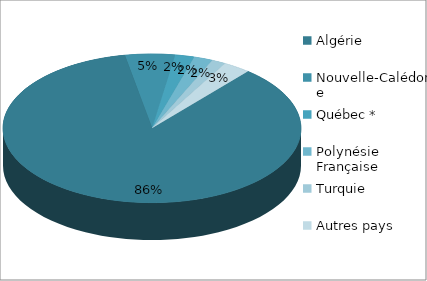
| Category | Series 0 |
|---|---|
| Algérie | 12946 |
| Nouvelle-Calédonie | 817 |
| Québec * | 315 |
| Polynésie Française | 309 |
| Turquie | 227 |
| Autres pays | 449 |